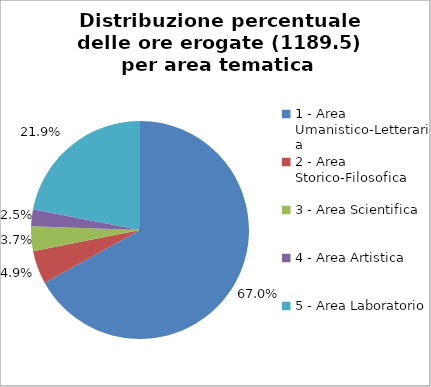
| Category | Nr. Ore Erogate |
|---|---|
| 1 - Area Umanistico-Letteraria | 796.5 |
| 2 - Area Storico-Filosofica | 58.5 |
| 3 - Area Scientifica | 43.5 |
| 4 - Area Artistica | 30 |
| 5 - Area Laboratorio | 261 |